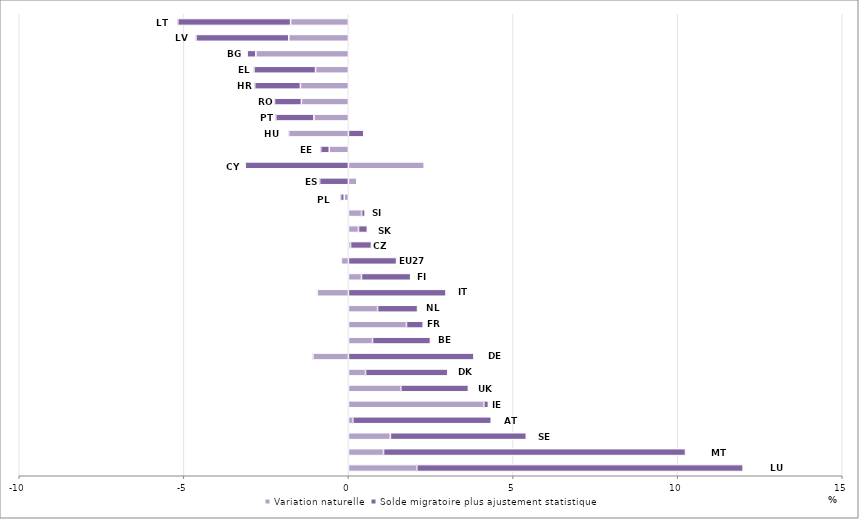
| Category | Variation naturelle | Solde migratoire plus ajustement statistique |
|---|---|---|
| LU | 2.074 | 9.915 |
| MT | 1.065 | 9.174 |
| SE | 1.274 | 4.129 |
| AT | 0.132 | 4.206 |
| IE | 4.111 | 0.14 |
| UK | 1.589 | 2.055 |
| DK | 0.519 | 2.496 |
| DE | -1.08 | 3.811 |
| BE | 0.732 | 1.759 |
| FR | 1.763 | 0.507 |
| NL | 0.885 | 1.214 |
| IT | -0.95 | 2.963 |
| FI | 0.396 | 1.493 |
| EU27 | -0.214 | 1.462 |
| CZ | 0.064 | 0.635 |
| SK | 0.305 | 0.269 |
| SI | 0.399 | 0.107 |
| PL | -0.129 | -0.11 |
| ES | 0.254 | -0.876 |
| CY | 2.3 | -3.136 |
| EE | -0.582 | -0.262 |
| HU | -1.818 | 0.465 |
| PT | -1.048 | -1.16 |
| RO | -1.429 | -0.818 |
| HR | -1.459 | -1.389 |
| EL | -0.999 | -1.871 |
| BG | -2.812 | -0.264 |
| LV | -1.812 | -2.819 |
| LT | -1.757 | -3.428 |